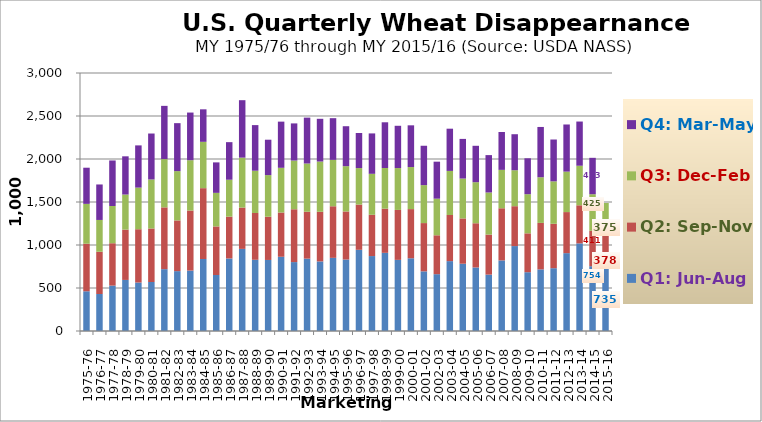
| Category | Q1: Jun-Aug | Q2: Sep-Nov | Q3: Dec-Feb | Q4: Mar-May |
|---|---|---|---|---|
| 1975-76 | 461.927 | 553.2 | 463.1 | 420.471 |
| 1976-77 | 430.009 | 491.5 | 369.7 | 412.651 |
| 1977-78 | 527.776 | 492.8 | 433.2 | 529.092 |
| 1978-79 | 593.832 | 585 | 407.9 | 444.401 |
| 1979-80 | 563.759 | 619.6 | 484 | 490.901 |
| 1980-81 | 569.733 | 622.3 | 570.1 | 534.187 |
| 1981-82 | 719.17 | 718.4 | 561.5 | 618.836 |
| 1982-83 | 696.231 | 589.5 | 573.4 | 557.737 |
| 1983-84 | 702.486 | 698.33 | 585.286 | 553.979 |
| 1984-85 | 837.127 | 823.791 | 538.819 | 377.886 |
| 1985-86 | 650.923 | 565.166 | 390.292 | 354.279 |
| 1986-87 | 843.347 | 486.654 | 429.083 | 436.813 |
| 1987-88 | 954.835 | 480.419 | 580.755 | 667.821 |
| 1988-89 | 828.077 | 543.917 | 491.853 | 530.241 |
| 1989-90 | 826.067 | 502.662 | 484.033 | 411.494 |
| 1990-91 | 863.143 | 514.543 | 520.034 | 536.786 |
| 1991-92 | 801.348 | 614.225 | 566.484 | 431.889 |
| 1992-93 | 841.391 | 545.263 | 560.798 | 533.716 |
| 1993-94 | 809.08 | 576.994 | 584.604 | 496.747 |
| 1994-95 | 850.693 | 599.813 | 539.557 | 484.764 |
| 1995-96 | 830.917 | 559.084 | 526.561 | 464.644 |
| 1996-97 | 944.063 | 526.053 | 424.074 | 407.944 |
| 1997-98 | 871.439 | 479.883 | 476.445 | 469.751 |
| 1998-99 | 908.857 | 513.563 | 472.983 | 531.464 |
| 1999-00 | 827.022 | 580.757 | 486.668 | 491.794 |
| 2000-01 | 845.627 | 571.664 | 489.127 | 485.133 |
| 2001-02 | 693.534 | 561.399 | 441.237 | 457.904 |
| 2002-03 | 660.66 | 452.205 | 425.924 | 430.159 |
| 2003-04 | 812.563 | 536.438 | 512.573 | 490.845 |
| 2004-05 | 782.237 | 526.764 | 463.709 | 460.989 |
| 2005-06 | 738.709 | 514.205 | 477.307 | 423.369 |
| 2006-07 | 655.535 | 465.343 | 489.648 | 434.789 |
| 2007-08 | 820.702 | 606.475 | 446.443 | 440.434 |
| 2008-09 | 987.595 | 463.586 | 418.426 | 418.573 |
| 2009-10 | 683.697 | 451.909 | 455.222 | 417.548 |
| 2010-11 | 716.541 | 540.434 | 530.942 | 584.663 |
| 2011-12 | 730.261 | 516.42 | 493.528 | 486.396 |
| 2012-13 | 905.328 | 477.467 | 470.443 | 548.118 |
| 2013-14 | 1018.886 | 442.812 | 459.922 | 514.019 |
| 2014-15 | 753.614 | 411.471 | 425.323 | 423.249 |
| 2015-16 | 735.274 | 378 | 375 | 0 |